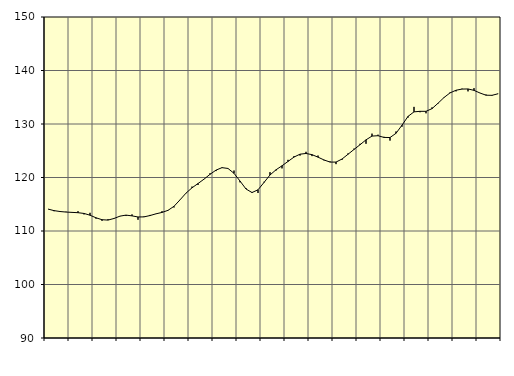
| Category | Piggar | Samtliga anställda (inkl. anställda utomlands) |
|---|---|---|
| nan | 114.1 | 114.1 |
| 1.0 | 113.7 | 113.81 |
| 1.0 | 113.6 | 113.64 |
| 1.0 | 113.6 | 113.54 |
| nan | 113.5 | 113.48 |
| 2.0 | 113.7 | 113.42 |
| 2.0 | 113.1 | 113.28 |
| 2.0 | 113.4 | 112.95 |
| nan | 112.3 | 112.47 |
| 3.0 | 111.9 | 112.11 |
| 3.0 | 112.2 | 112.04 |
| 3.0 | 112.3 | 112.34 |
| nan | 112.8 | 112.78 |
| 4.0 | 112.8 | 112.97 |
| 4.0 | 113.1 | 112.83 |
| 4.0 | 112.1 | 112.62 |
| nan | 112.7 | 112.64 |
| 5.0 | 113 | 112.89 |
| 5.0 | 113.2 | 113.21 |
| 5.0 | 113.7 | 113.47 |
| nan | 113.9 | 113.86 |
| 6.0 | 114.4 | 114.62 |
| 6.0 | 115.8 | 115.82 |
| 6.0 | 117.1 | 117.08 |
| nan | 118.3 | 118.07 |
| 7.0 | 118.6 | 118.87 |
| 7.0 | 119.7 | 119.69 |
| 7.0 | 120.8 | 120.59 |
| nan | 121.2 | 121.38 |
| 8.0 | 121.9 | 121.84 |
| 8.0 | 121.7 | 121.69 |
| 8.0 | 121.3 | 120.78 |
| nan | 119.1 | 119.34 |
| 9.0 | 118 | 117.85 |
| 9.0 | 117.1 | 117.19 |
| 9.0 | 117.1 | 117.7 |
| nan | 119.2 | 119.07 |
| 10.0 | 121 | 120.47 |
| 10.0 | 121.3 | 121.44 |
| 10.0 | 121.7 | 122.19 |
| nan | 123.3 | 123 |
| 11.0 | 124 | 123.82 |
| 11.0 | 124.1 | 124.36 |
| 11.0 | 124.8 | 124.49 |
| nan | 124 | 124.27 |
| 12.0 | 124.1 | 123.8 |
| 12.0 | 123.2 | 123.28 |
| 12.0 | 123 | 122.88 |
| nan | 122.5 | 122.88 |
| 13.0 | 123.3 | 123.45 |
| 13.0 | 124.5 | 124.34 |
| 13.0 | 125.4 | 125.24 |
| nan | 126.3 | 126.12 |
| 14.0 | 126.3 | 127.04 |
| 14.0 | 128.2 | 127.74 |
| 14.0 | 128 | 127.81 |
| nan | 127.6 | 127.49 |
| 15.0 | 126.9 | 127.47 |
| 15.0 | 128.6 | 128.26 |
| 15.0 | 129.5 | 129.78 |
| nan | 131.2 | 131.42 |
| 16.0 | 133.2 | 132.27 |
| 16.0 | 132.2 | 132.37 |
| 16.0 | 132 | 132.37 |
| nan | 133.1 | 132.87 |
| 17.0 | 133.8 | 133.88 |
| 17.0 | 134.9 | 134.95 |
| 17.0 | 135.9 | 135.81 |
| nan | 136.1 | 136.31 |
| 18.0 | 136.6 | 136.53 |
| 18.0 | 136.1 | 136.55 |
| 18.0 | 136.7 | 136.29 |
| nan | 135.8 | 135.79 |
| 19.0 | 135.5 | 135.38 |
| 19.0 | 135.3 | 135.36 |
| 19.0 | 135.6 | 135.65 |